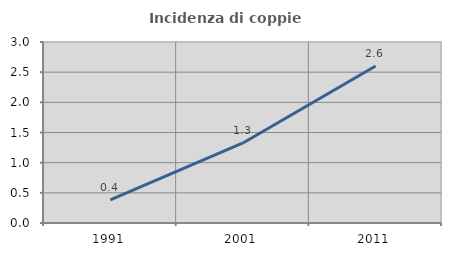
| Category | Incidenza di coppie miste |
|---|---|
| 1991.0 | 0.383 |
| 2001.0 | 1.326 |
| 2011.0 | 2.601 |